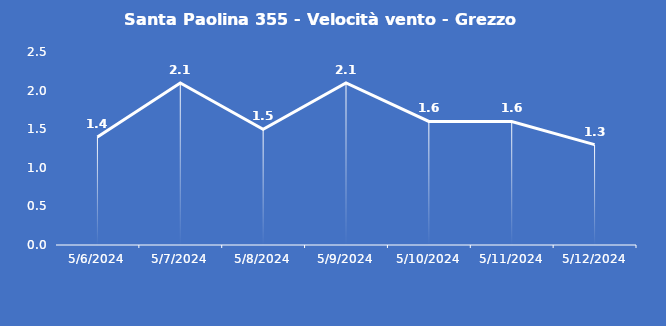
| Category | Santa Paolina 355 - Velocità vento - Grezzo (m/s) |
|---|---|
| 5/6/24 | 1.4 |
| 5/7/24 | 2.1 |
| 5/8/24 | 1.5 |
| 5/9/24 | 2.1 |
| 5/10/24 | 1.6 |
| 5/11/24 | 1.6 |
| 5/12/24 | 1.3 |